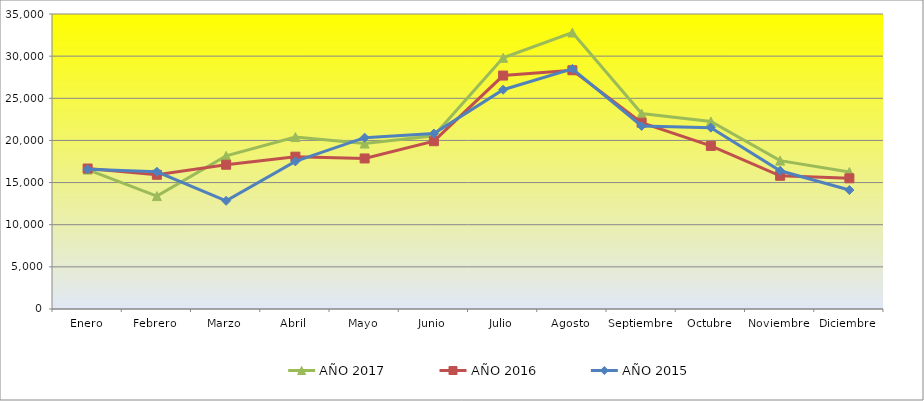
| Category | AÑO 2017 | AÑO 2016 | AÑO 2015 |
|---|---|---|---|
| Enero | 16539.562 | 16667 | 16568 |
| Febrero | 13395.766 | 15921 | 16284 |
| Marzo | 18170.073 | 17115 | 12833 |
| Abril | 20397.372 | 18074 | 17513 |
| Mayo | 19630.073 | 17861 | 20329 |
| Junio | 20546.569 | 19907 | 20816 |
| Julio | 29796.788 | 27697 | 26015 |
| Agosto | 32802.044 | 28326 | 28493 |
| Septiembre | 23189.489 | 22102 | 21716 |
| Octubre | 22243.179 | 19353 | 21516 |
| Noviembre | 17605.563 | 15804 | 16401 |
| Diciembre | 16262.482 | 15506 | 14114 |